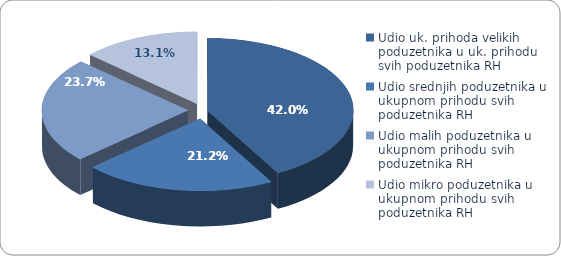
| Category | Udio |
|---|---|
| Udio uk. prihoda velikih poduzetnika u uk. prihodu svih poduzetnika RH | 0.42 |
| Udio srednjih poduzetnika u ukupnom prihodu svih poduzetnika RH | 0.212 |
| Udio malih poduzetnika u ukupnom prihodu svih poduzetnika RH | 0.237 |
| Udio mikro poduzetnika u ukupnom prihodu svih poduzetnika RH | 0.131 |